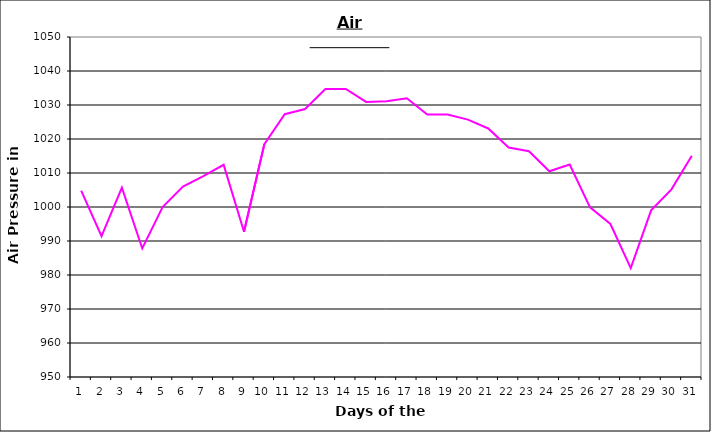
| Category | Series 0 |
|---|---|
| 0 | 1004.8 |
| 1 | 991.4 |
| 2 | 1005.7 |
| 3 | 987.8 |
| 4 | 1000 |
| 5 | 1006 |
| 6 | 1009.1 |
| 7 | 1012.4 |
| 8 | 992.7 |
| 9 | 1018.5 |
| 10 | 1027.3 |
| 11 | 1028.8 |
| 12 | 1034.7 |
| 13 | 1034.7 |
| 14 | 1030.9 |
| 15 | 1031.1 |
| 16 | 1032 |
| 17 | 1027.2 |
| 18 | 1027.2 |
| 19 | 1025.7 |
| 20 | 1023.1 |
| 21 | 1017.5 |
| 22 | 1016.4 |
| 23 | 1010.5 |
| 24 | 1012.5 |
| 25 | 999.9 |
| 26 | 995 |
| 27 | 982 |
| 28 | 999 |
| 29 | 1005.2 |
| 30 | 1015.1 |